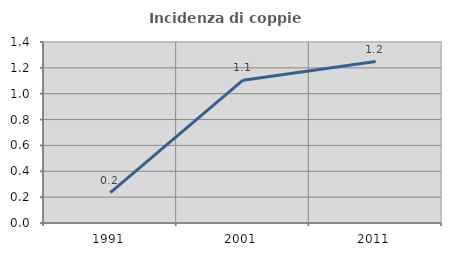
| Category | Incidenza di coppie miste |
|---|---|
| 1991.0 | 0.234 |
| 2001.0 | 1.105 |
| 2011.0 | 1.249 |